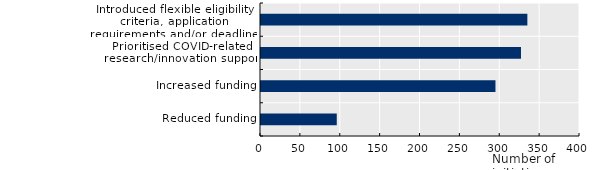
| Category | Series 0 |
|---|---|
| Reduced funding | 95 |
| Increased funding | 294 |
| Prioritised COVID-related research/innovation support | 326 |
| Introduced flexible eligibility criteria, application requirements and/or deadlines for funding | 334 |